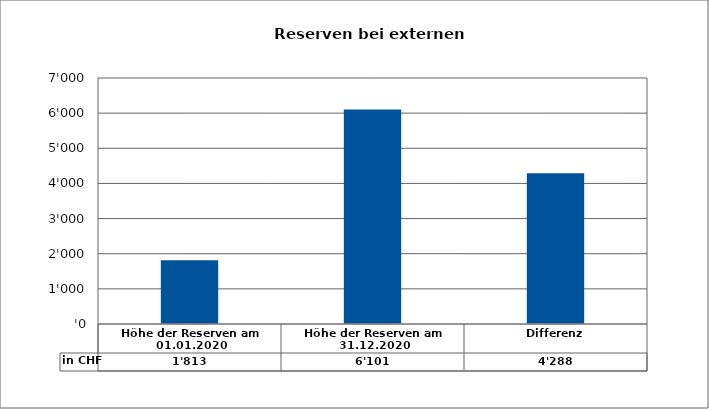
| Category | in CHF |
|---|---|
| Höhe der Reserven am 01.01.2020 | 1812.6 |
| Höhe der Reserven am 31.12.2020 | 6101 |
| Differenz | 4288.4 |